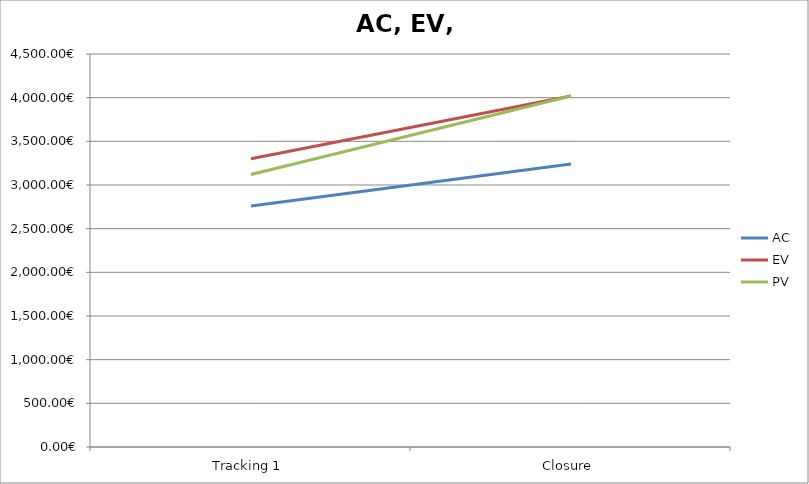
| Category | AC | EV | PV |
|---|---|---|---|
| Tracking 1 | 2760 | 3300.6 | 3120 |
| Closure | 3240 | 4020 | 4020 |